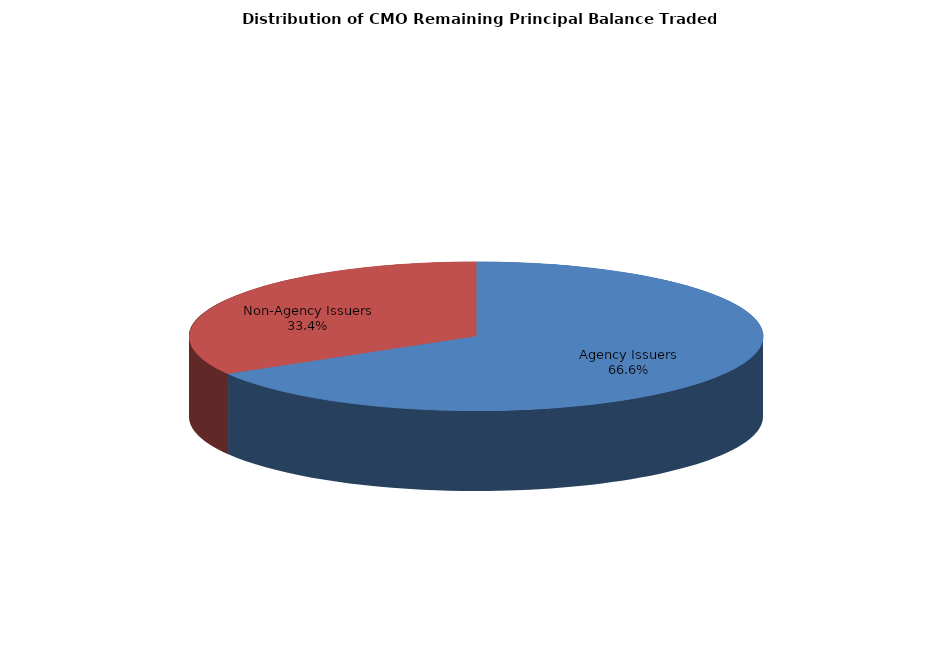
| Category | Series 0 |
|---|---|
| Agency Issuers | 4435143850.789 |
| Non-Agency Issuers | 2227634555.616 |